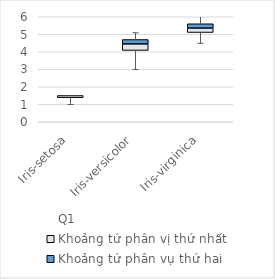
| Category | Q1 | Khoảng tứ phân vị thứ nhất | Khoảng tứ phân vụ thứ hai |
|---|---|---|---|
| Iris-setosa | 1.375 | 0.125 | 0 |
| Iris-versicolor | 4.075 | 0.375 | 0.25 |
| Iris-virginica | 5.1 | 0.25 | 0.25 |